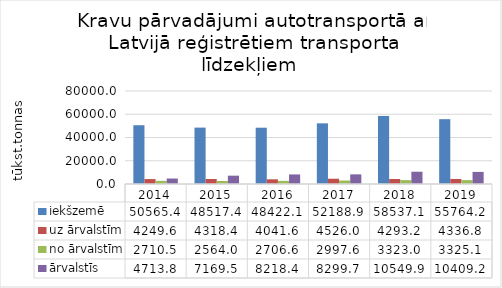
| Category | iekšzemē | uz ārvalstīm | no ārvalstīm | ārvalstīs |
|---|---|---|---|---|
| 2014.0 | 50565.4 | 4249.6 | 2710.5 | 4713.8 |
| 2015.0 | 48517.4 | 4318.4 | 2564 | 7169.5 |
| 2016.0 | 48422.1 | 4041.6 | 2706.6 | 8218.4 |
| 2017.0 | 52188.9 | 4526 | 2997.6 | 8299.7 |
| 2018.0 | 58537.1 | 4293.2 | 3323 | 10549.9 |
| 2019.0 | 55764.2 | 4336.8 | 3325.1 | 10409.2 |